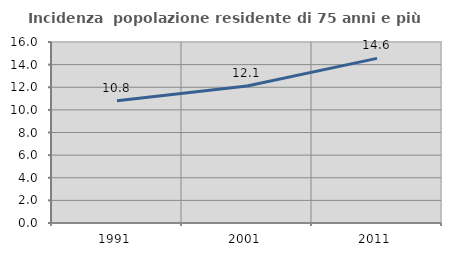
| Category | Incidenza  popolazione residente di 75 anni e più |
|---|---|
| 1991.0 | 10.801 |
| 2001.0 | 12.104 |
| 2011.0 | 14.553 |